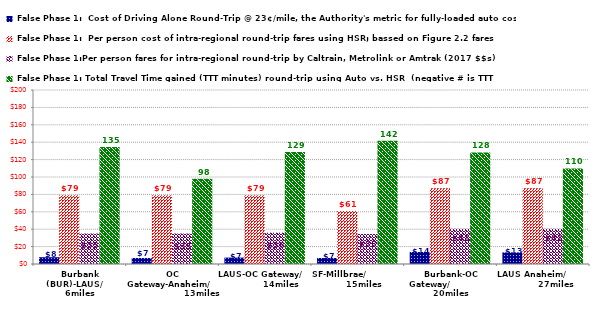
| Category | False Phase 1:  Cost of Driving Alone Round-Trip @ 23¢/mile, the Authority's metric for fully-loaded auto costs | False Phase 1:  Per person cost of intra-regional round-trip fares using HSR; bassed on Figure 2.2 fares | False Phase 1:Per person fares for intra-regional round-trip by Caltrain, Metrolink or Amtrak (2017 $$s) | False Phase 1: Total Travel Time gained (TTT minutes) round-trip using Auto vs. HSR  (negative # is TTT minutes more of Auto travel than HSR travel) |
|---|---|---|---|---|
| Burbank (BUR)-LAUS/     6miles | 7.82 | 79 | 35 | 134.6 |
| OC Gateway-Anaheim/                     13miles | 6.9 | 79 | 35 | 97.9 |
| LAUS-OC Gateway/              14miles | 7.36 | 79 | 36 | 128.7 |
| SF-Millbrae/                  15miles | 6.9 | 61 | 34.5 | 141.8 |
| Burbank-OC Gateway/                20miles | 13.8 | 87 | 40.5 | 128.2 |
| LAUS Anaheim/                 27miles | 13.34 | 87 | 40.5 | 109.9 |